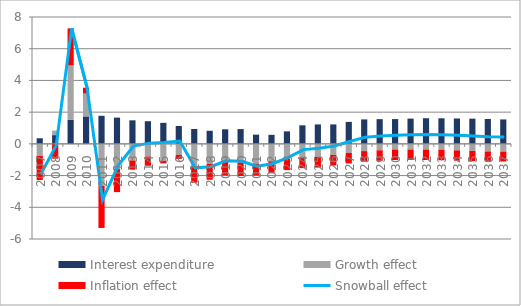
| Category | Interest expenditure | Growth effect | Inflation effect |
|---|---|---|---|
| 0 | 0.353 | -0.754 | -1.527 |
| 1 | 0.551 | 0.285 | -0.933 |
| 2 | 1.511 | 3.434 | 2.337 |
| 3 | 1.731 | 1.442 | 0.368 |
| 4 | 1.77 | -2.65 | -2.655 |
| 5 | 1.655 | -1.594 | -1.45 |
| 6 | 1.483 | -1.047 | -0.579 |
| 7 | 1.428 | -0.798 | -0.585 |
| 8 | 1.324 | -1.075 | -0.157 |
| 9 | 1.127 | -0.694 | -0.255 |
| 10 | 0.938 | -1.39 | -1.06 |
| 11 | 0.825 | -1.245 | -1.018 |
| 12 | 0.918 | -1.135 | -0.853 |
| 13 | 0.933 | -1.17 | -0.858 |
| 14 | 0.581 | -1.245 | -0.748 |
| 15 | 0.569 | -1.1 | -0.724 |
| 16 | 0.788 | -0.953 | -0.702 |
| 17 | 1.169 | -0.847 | -0.686 |
| 18 | 1.225 | -0.82 | -0.676 |
| 19 | 1.226 | -0.695 | -0.669 |
| 20 | 1.385 | -0.573 | -0.663 |
| 21 | 1.541 | -0.456 | -0.661 |
| 22 | 1.558 | -0.407 | -0.662 |
| 23 | 1.563 | -0.358 | -0.662 |
| 24 | 1.591 | -0.357 | -0.662 |
| 25 | 1.616 | -0.36 | -0.66 |
| 26 | 1.612 | -0.378 | -0.657 |
| 27 | 1.6 | -0.41 | -0.651 |
| 28 | 1.587 | -0.444 | -0.644 |
| 29 | 1.569 | -0.482 | -0.634 |
| 30 | 1.541 | -0.489 | -0.623 |